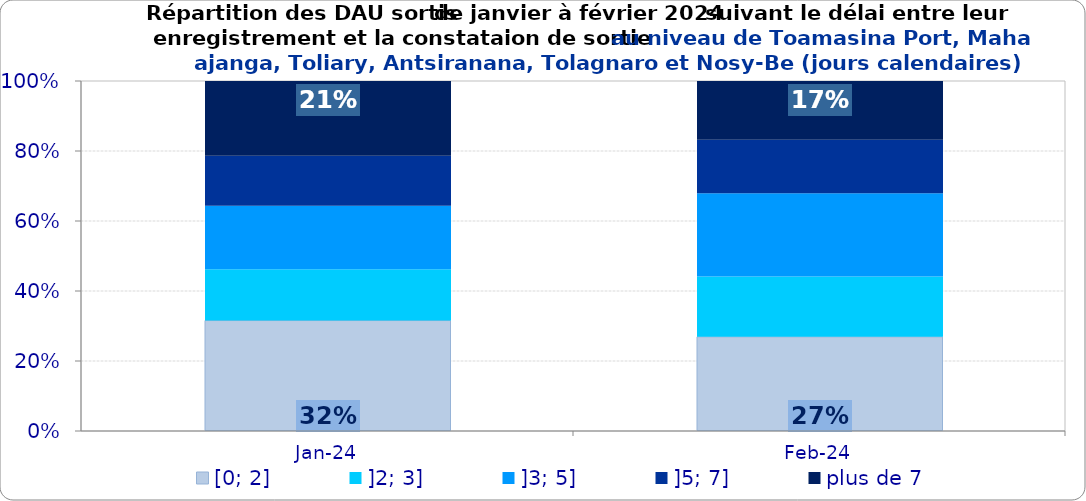
| Category | [0; 2] | ]2; 3] | ]3; 5] | ]5; 7] | plus de 7 |
|---|---|---|---|---|---|
| 2024-01-01 | 0.316 | 0.146 | 0.182 | 0.143 | 0.214 |
| 2024-02-01 | 0.269 | 0.172 | 0.238 | 0.153 | 0.168 |